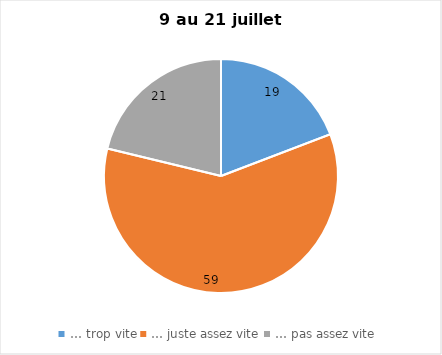
| Category | Series 0 |
|---|---|
| … trop vite | 19 |
| … juste assez vite | 59 |
| … pas assez vite | 21 |